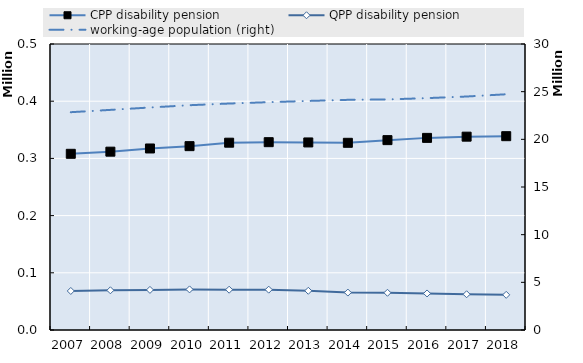
| Category | CPP disability pension | QPP disability pension |
|---|---|---|
| 2007.0 | 308039 | 68243 |
| 2008.0 | 311780 | 69425 |
| 2009.0 | 317337 | 70118 |
| 2010.0 | 321407 | 70979 |
| 2011.0 | 327457 | 70445 |
| 2012.0 | 328361 | 70518 |
| 2013.0 | 327904 | 68538 |
| 2014.0 | 327271 | 65437 |
| 2015.0 | 331940 | 65073 |
| 2016.0 | 335881 | 63885 |
| 2017.0 | 338009 | 62499 |
| 2018.0 | 338856 | 61466 |